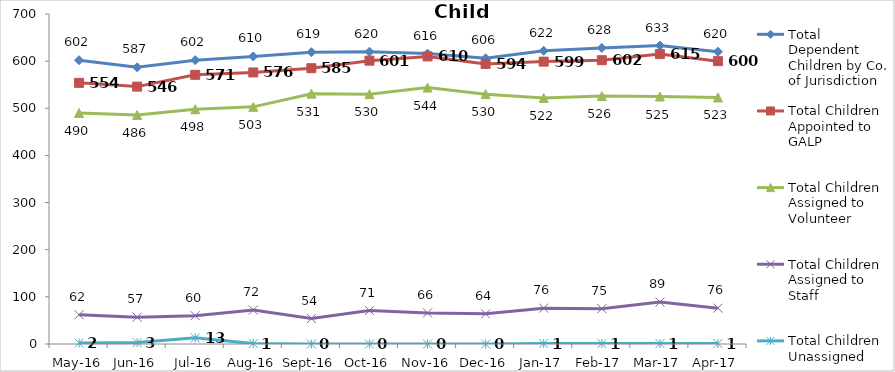
| Category | Total Dependent Children by Co. of Jurisdiction | Total Children Appointed to GALP | Total Children Assigned to Volunteer | Total Children Assigned to Staff | Total Children Unassigned |
|---|---|---|---|---|---|
| May-16 | 602 | 554 | 490 | 62 | 2 |
| Jun-16 | 587 | 546 | 486 | 57 | 3 |
| Jul-16 | 602 | 571 | 498 | 60 | 13 |
| Aug-16 | 610 | 576 | 503 | 72 | 1 |
| Sep-16 | 619 | 585 | 531 | 54 | 0 |
| Oct-16 | 620 | 601 | 530 | 71 | 0 |
| Nov-16 | 616 | 610 | 544 | 66 | 0 |
| Dec-16 | 606 | 594 | 530 | 64 | 0 |
| Jan-17 | 622 | 599 | 522 | 76 | 1 |
| Feb-17 | 628 | 602 | 526 | 75 | 1 |
| Mar-17 | 633 | 615 | 525 | 89 | 1 |
| Apr-17 | 620 | 600 | 523 | 76 | 1 |